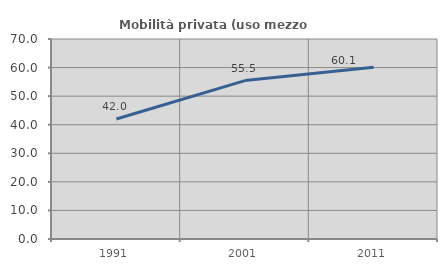
| Category | Mobilità privata (uso mezzo privato) |
|---|---|
| 1991.0 | 42.019 |
| 2001.0 | 55.451 |
| 2011.0 | 60.097 |